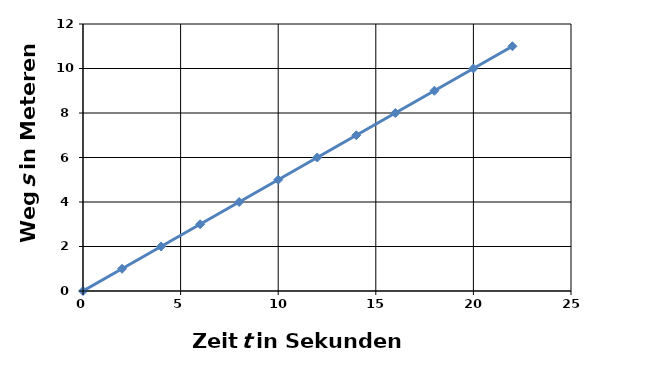
| Category | Series 0 |
|---|---|
| 0.0 | 0 |
| 2.0 | 1 |
| 4.0 | 2 |
| 6.0 | 3 |
| 8.0 | 4 |
| 10.0 | 5 |
| 12.0 | 6 |
| 14.0 | 7 |
| 16.0 | 8 |
| 18.0 | 9 |
| 20.0 | 10 |
| 22.0 | 11 |